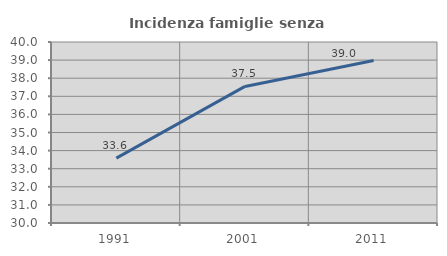
| Category | Incidenza famiglie senza nuclei |
|---|---|
| 1991.0 | 33.583 |
| 2001.0 | 37.546 |
| 2011.0 | 38.983 |